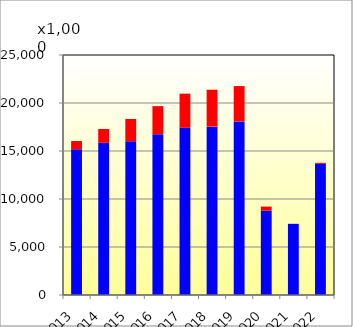
| Category | DOM | INT |
|---|---|---|
| 2013 | 15170115 | 869710 |
| 2014 | 15849316 | 1444464 |
| 2015 | 16007888 | 2328142 |
| 2016 | 16744343 | 2927511 |
| 2017 | 17435393 | 3537694 |
| 2018 | 17538905 | 3843938 |
| 2019 | 18080998 | 3680830 |
| 2020 | 8785788 | 424572 |
| 2021 | 7412065 | 3427 |
| 2022 | 13661102 | 104183 |